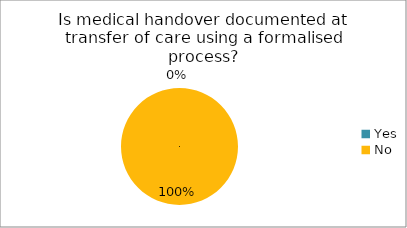
| Category | Is medical handover documented at transfer of care using a formalised process? | Is nursing handover documented at transfer of care using a formalised process? |
|---|---|---|
| Yes | 0 | 0 |
| No | 1 | 1 |